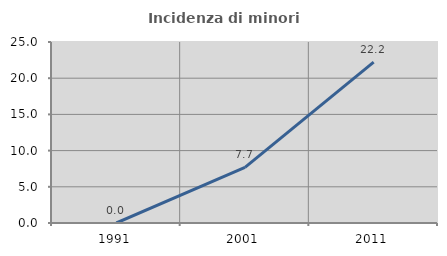
| Category | Incidenza di minori stranieri |
|---|---|
| 1991.0 | 0 |
| 2001.0 | 7.692 |
| 2011.0 | 22.222 |